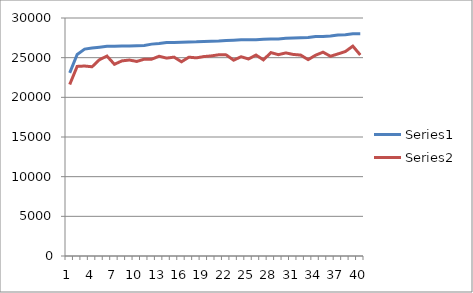
| Category | Series 0 | Series 1 |
|---|---|---|
| 0 | 23091 | 21619 |
| 1 | 25395 | 23899 |
| 2 | 26085 | 23947 |
| 3 | 26229 | 23853 |
| 4 | 26318 | 24752 |
| 5 | 26426 | 25198 |
| 6 | 26432 | 24164 |
| 7 | 26472 | 24594 |
| 8 | 26484 | 24702 |
| 9 | 26517 | 24525 |
| 10 | 26548 | 24808 |
| 11 | 26708 | 24810 |
| 12 | 26795 | 25177 |
| 13 | 26908 | 24942 |
| 14 | 26926 | 25068 |
| 15 | 26943 | 24483 |
| 16 | 26974 | 25062 |
| 17 | 26995 | 24977 |
| 18 | 27037 | 25139 |
| 19 | 27056 | 25222 |
| 20 | 27091 | 25365 |
| 21 | 27177 | 25351 |
| 22 | 27211 | 24681 |
| 23 | 27255 | 25117 |
| 24 | 27266 | 24834 |
| 25 | 27269 | 25331 |
| 26 | 27330 | 24722 |
| 27 | 27347 | 25641 |
| 28 | 27355 | 25377 |
| 29 | 27445 | 25599 |
| 30 | 27481 | 25407 |
| 31 | 27505 | 25327 |
| 32 | 27531 | 24753 |
| 33 | 27662 | 25310 |
| 34 | 27677 | 25691 |
| 35 | 27743 | 25177 |
| 36 | 27849 | 25471 |
| 37 | 27881 | 25773 |
| 38 | 28003 | 26457 |
| 39 | 28006 | 25340 |